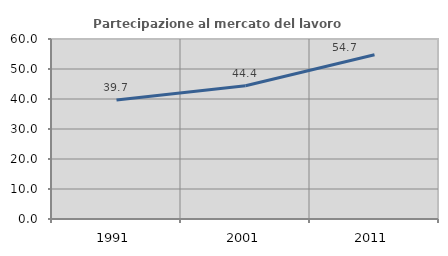
| Category | Partecipazione al mercato del lavoro  femminile |
|---|---|
| 1991.0 | 39.695 |
| 2001.0 | 44.444 |
| 2011.0 | 54.745 |